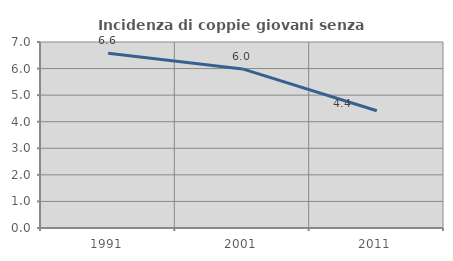
| Category | Incidenza di coppie giovani senza figli |
|---|---|
| 1991.0 | 6.575 |
| 2001.0 | 5.987 |
| 2011.0 | 4.411 |